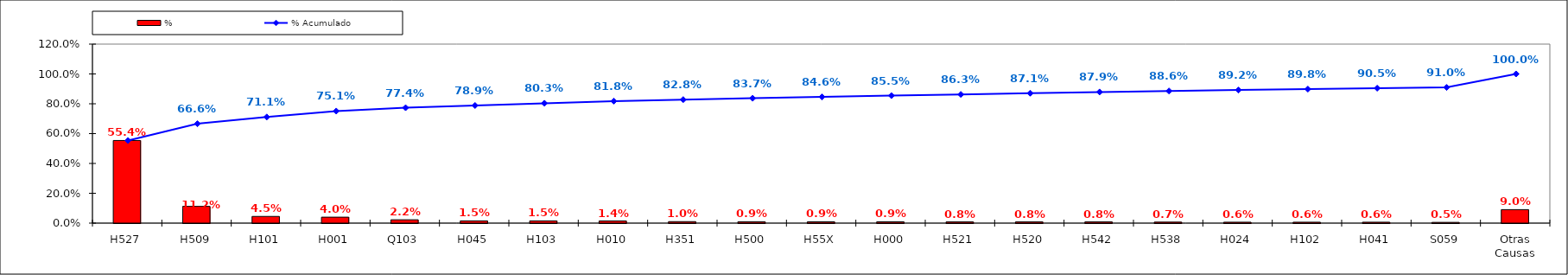
| Category | % |
|---|---|
| H527 | 0.554 |
| H509 | 0.112 |
| H101 | 0.045 |
| H001 | 0.04 |
| Q103 | 0.022 |
| H045 | 0.015 |
| H103 | 0.015 |
| H010 | 0.014 |
| H351 | 0.01 |
| H500 | 0.009 |
| H55X | 0.009 |
| H000 | 0.009 |
| H521 | 0.008 |
| H520 | 0.008 |
| H542 | 0.008 |
| H538 | 0.007 |
| H024 | 0.006 |
| H102 | 0.006 |
| H041 | 0.006 |
| S059 | 0.005 |
| Otras Causas | 0.09 |